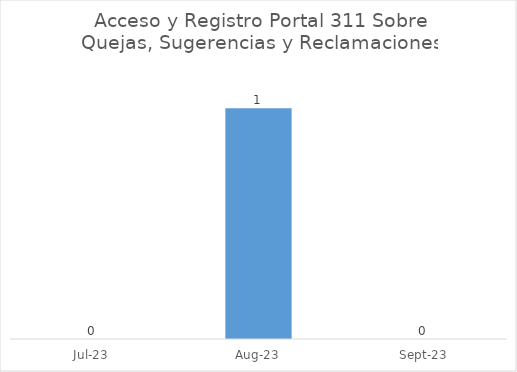
| Category | Cantidad |
|---|---|
| 2023-07-01 | 0 |
| 2023-08-01 | 1 |
| 2023-09-01 | 0 |